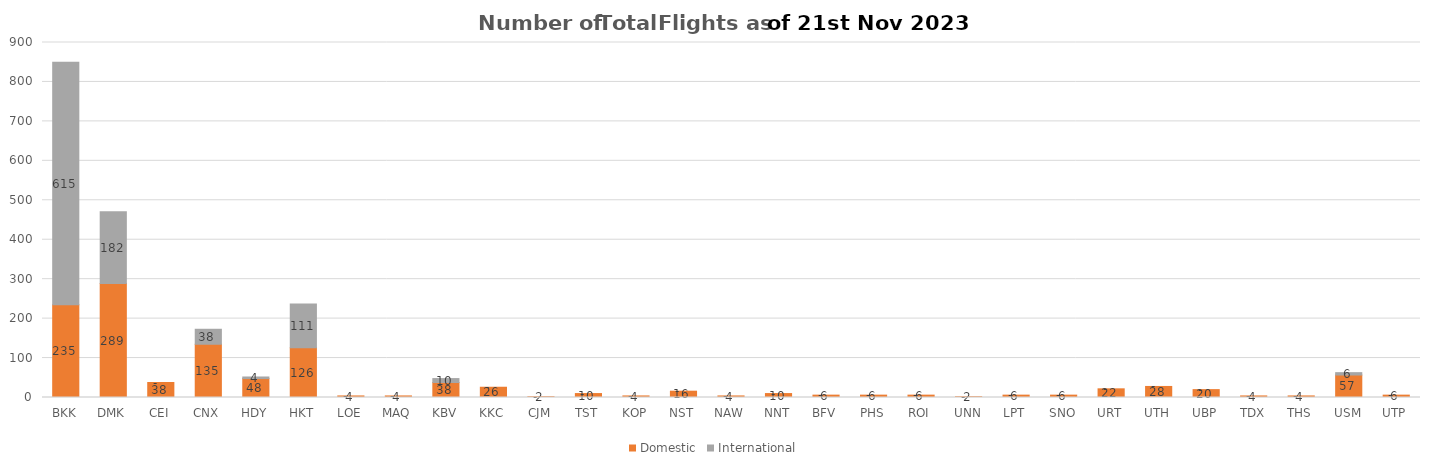
| Category | Domestic | International |
|---|---|---|
| BKK | 235 | 615 |
| DMK | 289 | 182 |
| CEI | 38 | 0 |
| CNX | 135 | 38 |
| HDY | 48 | 4 |
| HKT | 126 | 111 |
| LOE | 4 | 0 |
| MAQ | 4 | 0 |
| KBV | 38 | 10 |
| KKC | 26 | 0 |
| CJM | 2 | 0 |
| TST | 10 | 0 |
| KOP | 4 | 0 |
| NST | 16 | 0 |
| NAW | 4 | 0 |
| NNT | 10 | 0 |
| BFV | 6 | 0 |
| PHS | 6 | 0 |
| ROI | 6 | 0 |
| UNN | 2 | 0 |
| LPT | 6 | 0 |
| SNO | 6 | 0 |
| URT | 22 | 0 |
| UTH | 28 | 0 |
| UBP | 20 | 0 |
| TDX | 4 | 0 |
| THS | 4 | 0 |
| USM | 57 | 6 |
| UTP | 6 | 0 |